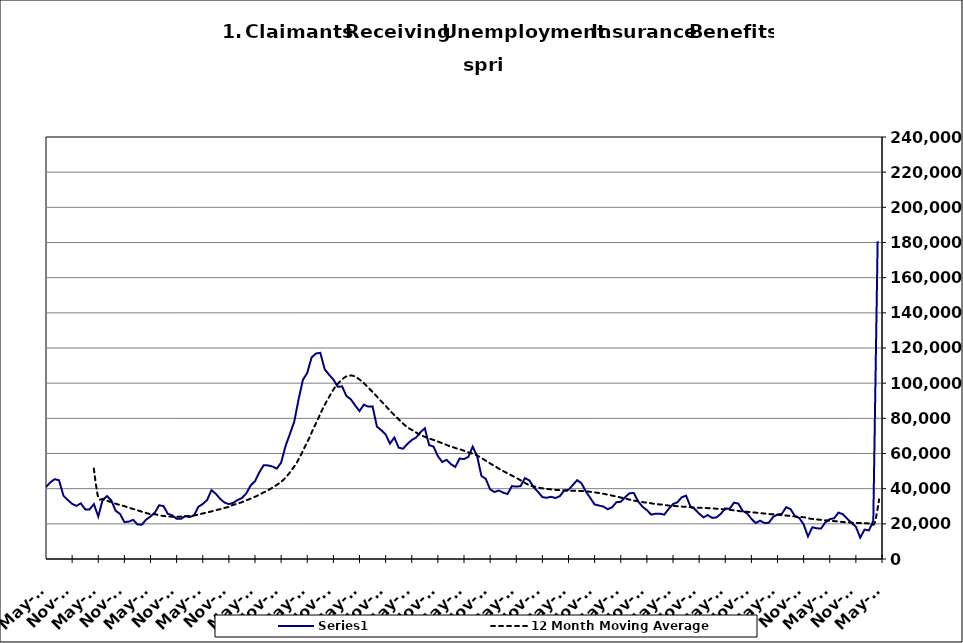
| Category | Series 0 |
|---|---|
| 2000-01-31 | 15239 |
| 2000-02-29 | 13995 |
| 2000-03-31 | 14536 |
| 2000-04-30 | 18337 |
| 2000-05-31 | 20863 |
| 2000-06-30 | 24310 |
| 2000-07-31 | 29359 |
| 2000-08-31 | 29764 |
| 2000-09-30 | 24540 |
| 2000-10-31 | 23067 |
| 2000-11-30 | 21129 |
| 2000-12-31 | 20288 |
| 2001-01-31 | 23646 |
| 2001-02-28 | 23782 |
| 2001-03-31 | 27047 |
| 2001-04-30 | 34048 |
| 2001-05-31 | 38168 |
| 2001-06-30 | 41894 |
| 2001-07-31 | 48114 |
| 2001-08-31 | 47646 |
| 2001-09-30 | 44132 |
| 2001-10-31 | 44465 |
| 2001-11-30 | 45928 |
| 2001-12-31 | 48930 |
| 2002-01-31 | 51864 |
| 2002-02-28 | 50778 |
| 2002-03-31 | 53014 |
| 2002-04-30 | 65394 |
| 2002-05-31 | 67925 |
| 2002-06-30 | 68727 |
| 2002-07-31 | 67269 |
| 2002-08-31 | 64233 |
| 2002-09-30 | 59955 |
| 2002-10-31 | 55535 |
| 2002-11-30 | 52233 |
| 2002-12-31 | 52252 |
| 2003-01-31 | 52694 |
| 2003-02-28 | 52578 |
| 2003-03-31 | 56236 |
| 2003-04-30 | 61020 |
| 2003-05-31 | 60584 |
| 2003-06-30 | 64980 |
| 2003-07-31 | 66426 |
| 2003-08-31 | 65403 |
| 2003-09-30 | 58348 |
| 2003-10-31 | 53953 |
| 2003-11-30 | 50453 |
| 2003-12-31 | 47799 |
| 2004-01-31 | 47134 |
| 2004-02-29 | 42441 |
| 2004-03-31 | 39363 |
| 2004-04-30 | 41157 |
| 2004-05-31 | 40892 |
| 2004-06-30 | 43601 |
| 2004-07-31 | 45411 |
| 2004-08-31 | 44738 |
| 2004-09-30 | 36049 |
| 2004-10-31 | 33551 |
| 2004-11-30 | 31386 |
| 2004-12-31 | 30195 |
| 2005-01-31 | 31661 |
| 2005-02-28 | 28205 |
| 2005-03-31 | 28194 |
| 2005-04-30 | 31233 |
| 2005-05-31 | 24184 |
| 2005-06-30 | 33525 |
| 2005-07-31 | 35776 |
| 2005-08-31 | 33297 |
| 2005-09-30 | 27423 |
| 2005-10-31 | 25647 |
| 2005-11-30 | 21039 |
| 2005-12-31 | 21238 |
| 2006-01-31 | 22270 |
| 2006-02-28 | 19689 |
| 2006-03-31 | 19474 |
| 2006-04-30 | 22420 |
| 2006-05-31 | 24146 |
| 2006-06-30 | 26450 |
| 2006-07-31 | 30575 |
| 2006-08-31 | 30038 |
| 2006-09-30 | 25657 |
| 2006-10-31 | 24869 |
| 2006-11-30 | 22832 |
| 2006-12-31 | 22826 |
| 2007-01-31 | 24459 |
| 2007-02-28 | 23856 |
| 2007-03-31 | 24786 |
| 2007-04-30 | 29690 |
| 2007-05-31 | 31303 |
| 2007-06-30 | 33512 |
| 2007-07-31 | 39176 |
| 2007-08-31 | 37077 |
| 2007-09-30 | 34179 |
| 2007-10-31 | 32130 |
| 2007-11-15 | 31205 |
| 2007-12-15 09:36:00 | 31973 |
| 2008-01-14 19:12:00 | 33494 |
| 2008-02-14 04:48:00 | 34694 |
| 2008-03-15 14:24:00 | 37279 |
| 2008-04-15 | 41840 |
| 2008-05-15 09:36:00 | 44245 |
| 2008-06-14 19:12:00 | 49341 |
| 2008-07-15 04:48:00 | 53353 |
| 2008-08-14 14:24:00 | 53222 |
| 2008-09-14 | 52594 |
| 2008-10-14 09:36:00 | 51417 |
| 2008-11-13 19:12:00 | 54795 |
| 2008-12-14 04:48:00 | 64139 |
| 2009-01-13 14:24:00 | 71026 |
| 2009-02-13 | 77947 |
| 2009-03-15 09:36:00 | 90649 |
| 2009-04-14 19:12:00 | 101865 |
| 2009-05-15 04:48:00 | 105867 |
| 2009-06-14 14:24:00 | 114626 |
| 2009-07-15 | 116882 |
| 2009-08-14 09:36:00 | 117270 |
| 2009-09-13 19:12:00 | 107943 |
| 2009-10-14 04:48:00 | 104849 |
| 2009-11-13 14:24:00 | 102065 |
| 2009-12-14 | 97917 |
| 2010-01-13 09:36:00 | 98175 |
| 2010-02-12 19:12:00 | 92691 |
| 2010-03-15 04:48:00 | 90832 |
| 2010-04-14 14:24:00 | 87347 |
| 2010-05-15 | 84120 |
| 2010-06-14 09:36:00 | 87787 |
| 2010-07-14 19:12:00 | 86654 |
| 2010-08-14 04:48:00 | 86789 |
| 2010-09-13 14:24:00 | 75317 |
| 2010-10-14 | 73259 |
| 2010-11-13 09:36:00 | 70783 |
| 2010-12-13 19:12:00 | 65644 |
| 2011-01-13 04:48:00 | 69106 |
| 2011-02-12 14:24:00 | 63322 |
| 2011-03-15 | 62724 |
| 2011-04-14 09:36:00 | 65434 |
| 2011-05-14 19:12:00 | 67641 |
| 2011-06-14 04:48:00 | 69087 |
| 2011-07-14 14:24:00 | 72082 |
| 2011-08-14 | 74376 |
| 2011-09-13 09:36:00 | 64739 |
| 2011-10-13 19:12:00 | 63965 |
| 2011-11-13 04:48:00 | 58496 |
| 2011-12-13 14:24:00 | 55173 |
| 2012-01-13 | 56418 |
| 2012-02-12 09:36:00 | 53942 |
| 2012-03-13 19:12:00 | 52352 |
| 2012-04-13 04:48:00 | 57118 |
| 2012-05-13 14:24:00 | 56827 |
| 2012-06-13 | 58115 |
| 2012-07-13 09:36:00 | 63863 |
| 2012-08-12 19:12:00 | 58706 |
| 2012-09-12 04:48:00 | 47243 |
| 2012-10-12 14:24:00 | 45567 |
| 2012-11-12 | 39623 |
| 2012-12-12 09:36:00 | 38101 |
| 2013-01-11 19:12:00 | 38966 |
| 2013-02-11 04:48:00 | 37746 |
| 2013-03-13 14:24:00 | 36956 |
| 2013-04-13 | 41439 |
| 2013-05-13 09:36:00 | 41162 |
| 2013-06-12 19:12:00 | 41455 |
| 2013-07-13 04:48:00 | 45989 |
| 2013-08-12 14:24:00 | 44712 |
| 2013-09-12 | 40828 |
| 2013-10-12 09:36:00 | 38185 |
| 2013-11-11 19:12:00 | 35184 |
| 2013-12-12 04:48:00 | 34824 |
| 2014-01-11 14:24:00 | 35396 |
| 2014-02-11 | 34683 |
| 2014-03-13 09:36:00 | 35748 |
| 2014-04-12 19:12:00 | 38892 |
| 2014-05-13 04:48:00 | 39325 |
| 2014-06-12 14:24:00 | 42091 |
| 2014-07-13 | 44842 |
| 2014-08-14 | 43016 |
| 2014-09-13 09:36:00 | 38304 |
| 2014-10-13 19:12:00 | 34708 |
| 2014-11-13 04:48:00 | 31017 |
| 2014-12-13 14:24:00 | 30402 |
| 2015-01-13 | 29823 |
| 2015-02-12 09:36:00 | 28333 |
| 2015-03-14 19:12:00 | 29389 |
| 2015-04-14 04:48:00 | 32293 |
| 2015-05-14 14:24:00 | 32538 |
| 2015-06-14 | 35137 |
| 2015-07-14 09:36:00 | 37398 |
| 2015-08-13 19:12:00 | 37536 |
| 2015-09-13 04:48:00 | 32808 |
| 2015-10-13 14:24:00 | 29728 |
| 2015-11-13 | 27775 |
| 2015-12-13 09:36:00 | 25227 |
| 2016-01-12 19:12:00 | 25773 |
| 2016-02-12 04:48:00 | 25758 |
| 2016-03-13 14:24:00 | 25247 |
| 2016-04-13 | 28463 |
| 2016-05-13 09:36:00 | 31210 |
| 2016-06-12 19:12:00 | 32255 |
| 2016-07-13 04:48:00 | 35088 |
| 2016-08-12 14:24:00 | 36018 |
| 2016-09-12 | 29922 |
| 2016-10-12 09:36:00 | 28368 |
| 2016-11-11 19:12:00 | 25818 |
| 2016-12-12 04:48:00 | 23690 |
| 2017-01-11 14:24:00 | 24964 |
| 2017-02-11 | 23348 |
| 2017-03-13 09:36:00 | 23685 |
| 2017-04-12 19:12:00 | 25733 |
| 2017-05-13 04:48:00 | 28796 |
| 2017-06-12 14:24:00 | 28489 |
| 2017-07-13 | 32034 |
| 2017-08-12 09:36:00 | 31539 |
| 2017-09-11 19:12:00 | 27321 |
| 2017-10-12 04:48:00 | 25990 |
| 2017-11-11 14:24:00 | 22875 |
| 2017-12-12 | 20445 |
| 2018-01-11 09:36:00 | 21794 |
| 2018-02-10 19:12:00 | 20475 |
| 2018-03-13 04:48:00 | 20585 |
| 2018-04-12 14:24:00 | 23969 |
| 2018-05-13 | 25280 |
| 2018-06-12 09:36:00 | 25741 |
| 2018-07-12 19:12:00 | 29479 |
| 2018-08-12 04:48:00 | 28351 |
| 2018-09-11 14:24:00 | 24386 |
| 2018-10-12 | 23292 |
| 2018-11-11 09:36:00 | 19711 |
| 2018-12-11 19:12:00 | 12853 |
| 2019-01-11 04:48:00 | 18039 |
| 2019-02-10 14:24:00 | 17466 |
| 2019-03-13 | 17325 |
| 2019-04-12 09:36:00 | 20890 |
| 2019-05-12 19:12:00 | 22641 |
| 2019-06-12 04:48:00 | 23178 |
| 2019-07-12 14:24:00 | 26385 |
| 2019-08-12 | 25501 |
| 2019-09-11 09:36:00 | 22892 |
| 2019-10-11 19:12:00 | 20585 |
| 2019-11-11 04:48:00 | 18323 |
| 2019-12-11 14:24:00 | 12174 |
| 2020-01-11 | 16683 |
| 2020-02-10 09:36:00 | 16260 |
| 2020-03-11 19:12:00 | 21670 |
| 2020-04-11 04:48:00 | 180743 |
| 2020-05-11 14:24:00 | 223563 |